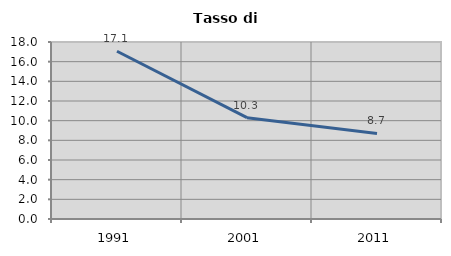
| Category | Tasso di disoccupazione   |
|---|---|
| 1991.0 | 17.062 |
| 2001.0 | 10.302 |
| 2011.0 | 8.696 |